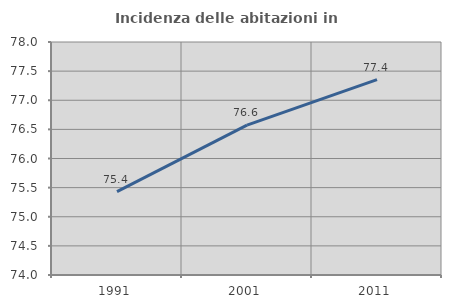
| Category | Incidenza delle abitazioni in proprietà  |
|---|---|
| 1991.0 | 75.433 |
| 2001.0 | 76.572 |
| 2011.0 | 77.355 |